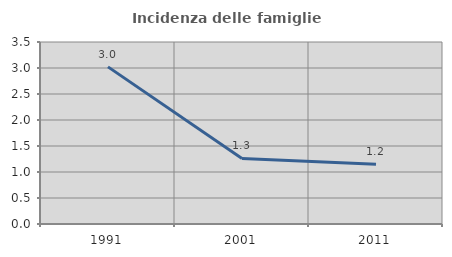
| Category | Incidenza delle famiglie numerose |
|---|---|
| 1991.0 | 3.022 |
| 2001.0 | 1.26 |
| 2011.0 | 1.151 |